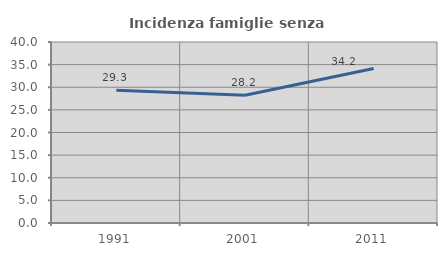
| Category | Incidenza famiglie senza nuclei |
|---|---|
| 1991.0 | 29.31 |
| 2001.0 | 28.226 |
| 2011.0 | 34.164 |